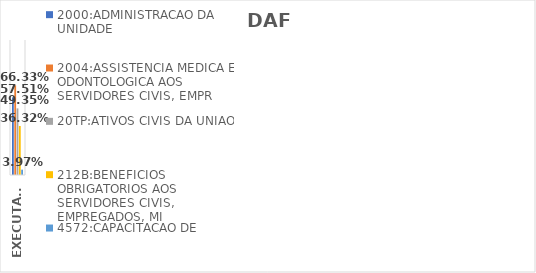
| Category | 2000:ADMINISTRACAO DA UNIDADE | 2004:ASSISTENCIA MEDICA E ODONTOLOGICA AOS SERVIDORES CIVIS, EMPR | 20TP:ATIVOS CIVIS DA UNIAO | 212B:BENEFICIOS OBRIGATORIOS AOS SERVIDORES CIVIS, EMPREGADOS, MI | 4572:CAPACITACAO DE SERVIDORES PUBLICOS FEDERAIS EM PROCESSO DE Q |
|---|---|---|---|---|---|
| EXECUTADO | 0.575 | 0.663 | 0.494 | 0.363 | 0.04 |